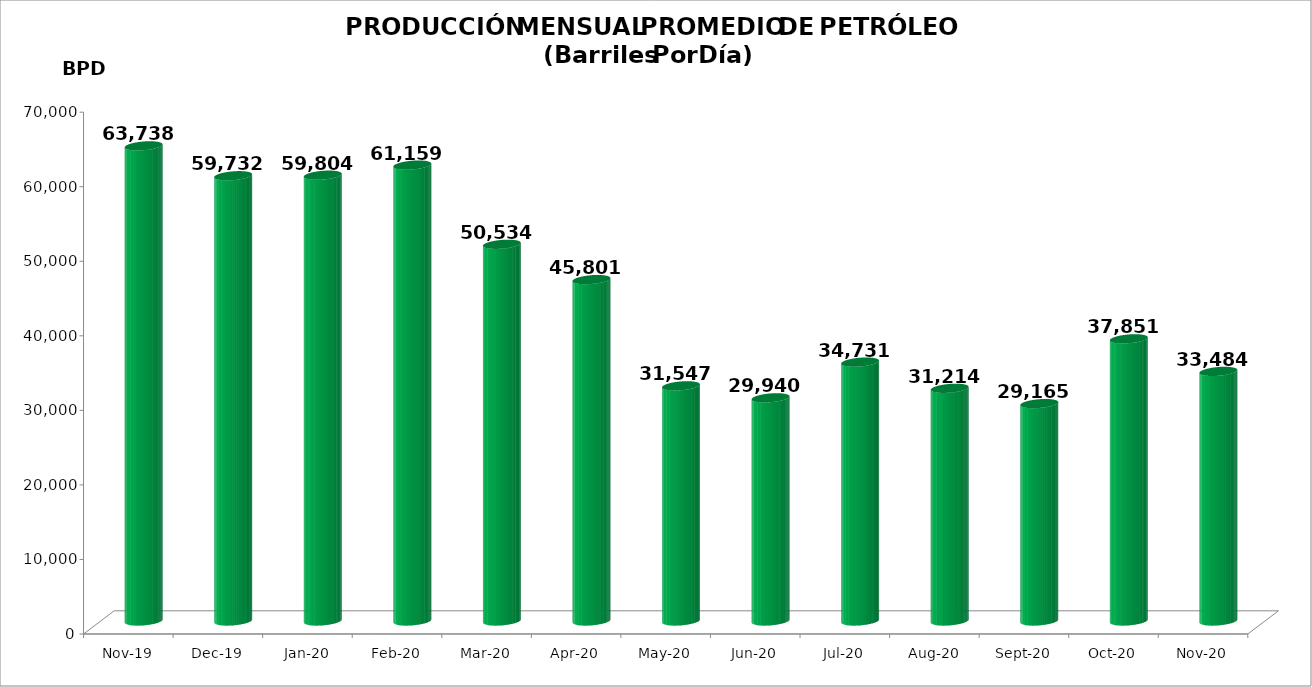
| Category | Series 0 |
|---|---|
| 2019-11-01 | 63738.3 |
| 2019-12-01 | 59732 |
| 2020-01-01 | 59804 |
| 2020-02-01 | 61159 |
| 2020-03-01 | 50534 |
| 2020-04-01 | 45801 |
| 2020-05-01 | 31547 |
| 2020-06-01 | 29940 |
| 2020-07-01 | 34731 |
| 2020-08-01 | 31214 |
| 2020-09-01 | 29165 |
| 2020-10-01 | 37851 |
| 2020-11-01 | 33484 |